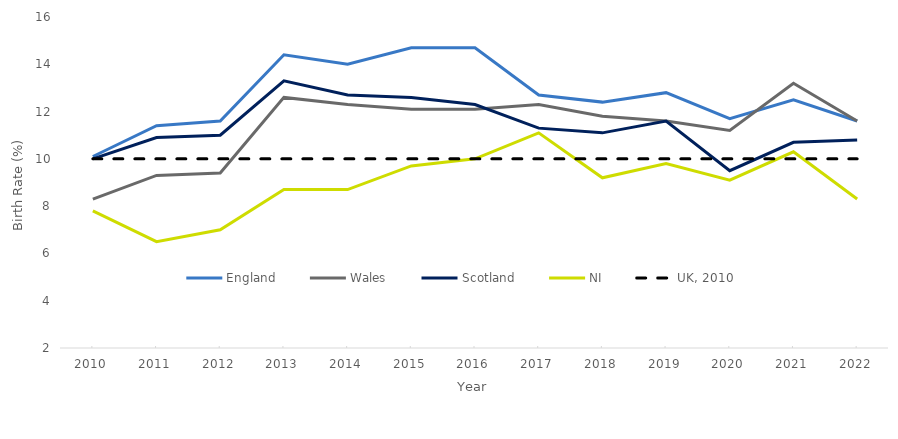
| Category | England | Wales | Scotland | NI | UK, 2010 |
|---|---|---|---|---|---|
| 2010.0 | 10.1 | 8.3 | 10 | 7.8 | 10 |
| 2011.0 | 11.4 | 9.3 | 10.9 | 6.5 | 10 |
| 2012.0 | 11.6 | 9.4 | 11 | 7 | 10 |
| 2013.0 | 14.4 | 12.6 | 13.3 | 8.7 | 10 |
| 2014.0 | 14 | 12.3 | 12.7 | 8.7 | 10 |
| 2015.0 | 14.7 | 12.1 | 12.6 | 9.7 | 10 |
| 2016.0 | 14.7 | 12.1 | 12.3 | 10 | 10 |
| 2017.0 | 12.7 | 12.3 | 11.3 | 11.1 | 10 |
| 2018.0 | 12.4 | 11.8 | 11.1 | 9.2 | 10 |
| 2019.0 | 12.8 | 11.6 | 11.6 | 9.8 | 10 |
| 2020.0 | 11.7 | 11.2 | 9.5 | 9.1 | 10 |
| 2021.0 | 12.5 | 13.2 | 10.7 | 10.3 | 10 |
| 2022.0 | 11.6 | 11.6 | 10.8 | 8.3 | 10 |